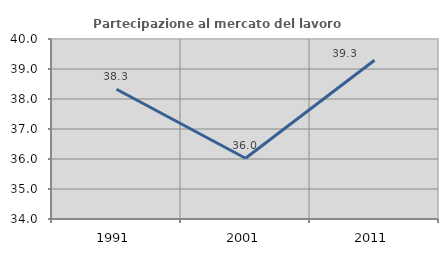
| Category | Partecipazione al mercato del lavoro  femminile |
|---|---|
| 1991.0 | 38.324 |
| 2001.0 | 36.025 |
| 2011.0 | 39.294 |